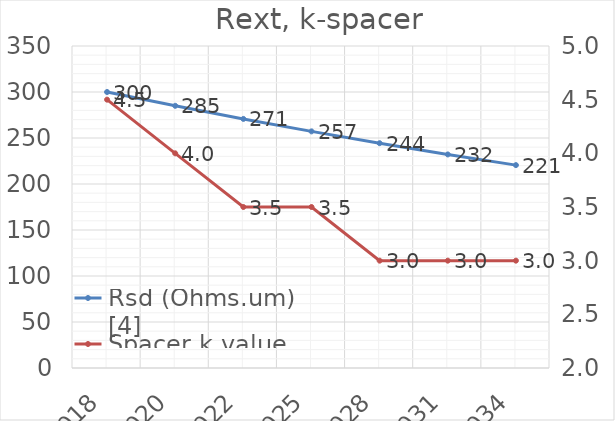
| Category | Rsd (Ohms.um) [4] |
|---|---|
| 2018.0 | 300 |
| 2020.0 | 285 |
| 2022.0 | 270.75 |
| 2025.0 | 257.212 |
| 2028.0 | 244.352 |
| 2031.0 | 232.134 |
| 2034.0 | 220.528 |